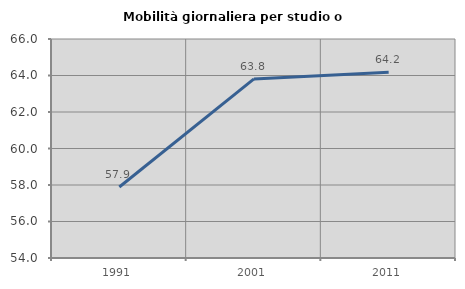
| Category | Mobilità giornaliera per studio o lavoro |
|---|---|
| 1991.0 | 57.891 |
| 2001.0 | 63.813 |
| 2011.0 | 64.175 |